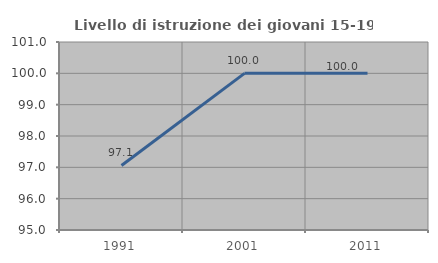
| Category | Livello di istruzione dei giovani 15-19 anni |
|---|---|
| 1991.0 | 97.059 |
| 2001.0 | 100 |
| 2011.0 | 100 |